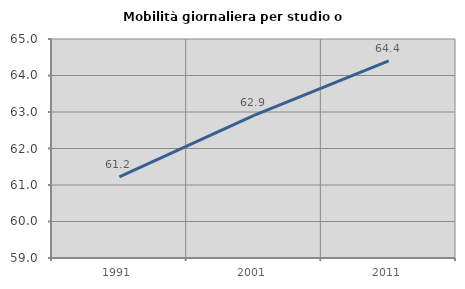
| Category | Mobilità giornaliera per studio o lavoro |
|---|---|
| 1991.0 | 61.221 |
| 2001.0 | 62.906 |
| 2011.0 | 64.4 |